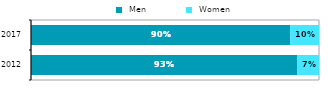
| Category |  Men |  Women |
|---|---|---|
| 2012.0 | 0.925 | 0.075 |
| 2017.0 | 0.9 | 0.1 |